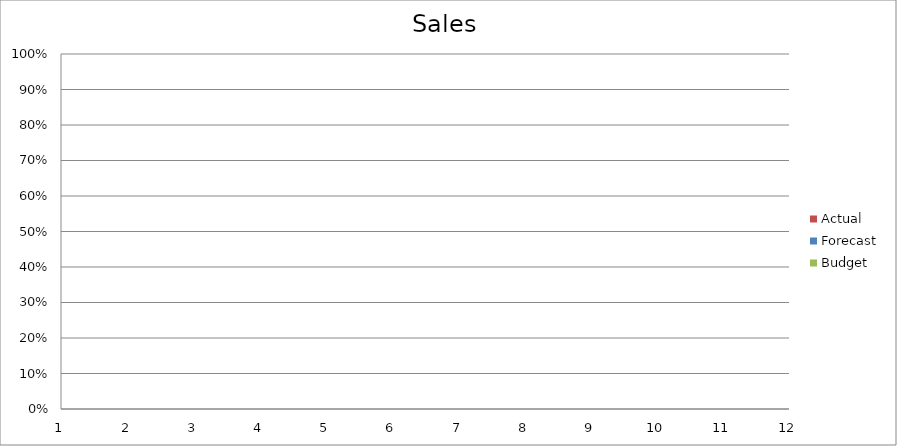
| Category | Budget | Forecast | Actual |
|---|---|---|---|
| 0 | 2440 | 3370 | 3400 |
| 1 | 1000 | 1890 | 3370 |
| 2 | 1300 | 2380 | 3110 |
| 3 | 1950 | 1570 | 1320 |
| 4 | 2200 | 2790 | 1380 |
| 5 | 1900 | 2800 | 1250 |
| 6 | 950 | 1680 | 2030 |
| 7 | 3500 | 1890 | 1570 |
| 8 | 3100 | 1170 | 3160 |
| 9 | 1210 | 1360 | 2830 |
| 10 | 510 | 3440 | 1000 |
| 11 | 2340 | 1060 | 1300 |